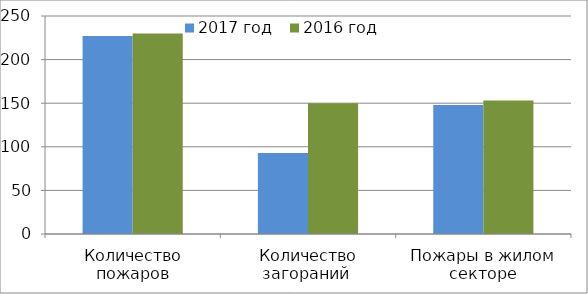
| Category | 2017 год | 2016 год |
|---|---|---|
| Количество пожаров | 227 | 230 |
| Количество загораний  | 93 | 150 |
| Пожары в жилом секторе | 148 | 153 |